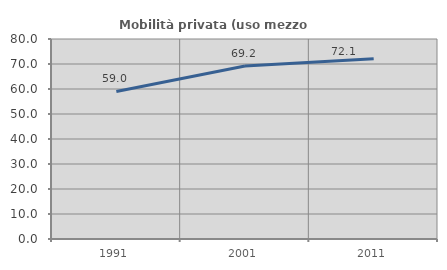
| Category | Mobilità privata (uso mezzo privato) |
|---|---|
| 1991.0 | 59.03 |
| 2001.0 | 69.189 |
| 2011.0 | 72.131 |